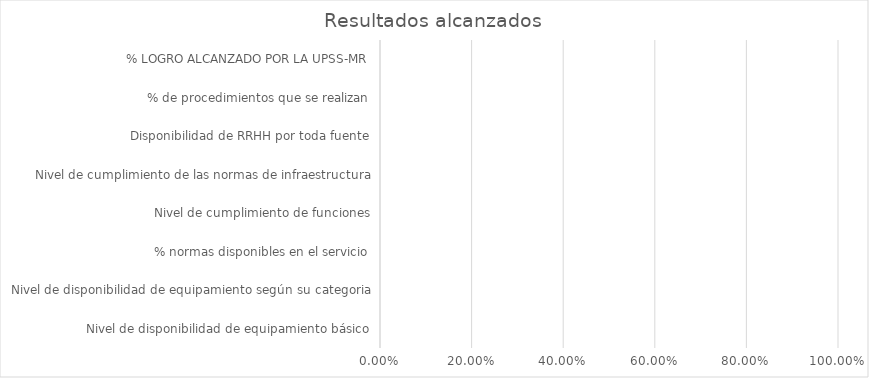
| Category | Series 0 |
|---|---|
| Nivel de disponibilidad de equipamiento básico | 0 |
| Nivel de disponibilidad de equipamiento según su categoria | 0 |
| % normas disponibles en el servicio | 0 |
| Nivel de cumplimiento de funciones | 0 |
| Nivel de cumplimiento de las normas de infraestructura | 0 |
| Disponibilidad de RRHH por toda fuente | 0 |
| % de procedimientos que se realizan | 0 |
| % LOGRO ALCANZADO POR LA UPSS-MR | 0 |